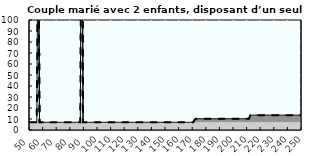
| Category | Coin fiscal marginal (somme des composantes) | Taux d’imposition marginal net |
|---|---|---|
| 50.0 | 7 | 7 |
| 51.0 | 7 | 7 |
| 52.0 | 7 | 7 |
| 53.0 | 7 | 7 |
| 54.0 | 7 | 7 |
| 55.0 | 7 | 7 |
| 56.0 | 225.815 | 225.815 |
| 57.0 | 7 | 7 |
| 58.0 | 7 | 7 |
| 59.0 | 7 | 7 |
| 60.0 | 7 | 7 |
| 61.0 | 7 | 7 |
| 62.0 | 7 | 7 |
| 63.0 | 7 | 7 |
| 64.0 | 7 | 7 |
| 65.0 | 7 | 7 |
| 66.0 | 7 | 7 |
| 67.0 | 7 | 7 |
| 68.0 | 7 | 7 |
| 69.0 | 7 | 7 |
| 70.0 | 7 | 7 |
| 71.0 | 7 | 7 |
| 72.0 | 7 | 7 |
| 73.0 | 7 | 7 |
| 74.0 | 7 | 7 |
| 75.0 | 7 | 7 |
| 76.0 | 7 | 7 |
| 77.0 | 7 | 7 |
| 78.0 | 7 | 7 |
| 79.0 | 7 | 7 |
| 80.0 | 7 | 7 |
| 81.0 | 7 | 7 |
| 82.0 | 7 | 7 |
| 83.0 | 7 | 7 |
| 84.0 | 7 | 7 |
| 85.0 | 7 | 7 |
| 86.0 | 7 | 7 |
| 87.0 | 7 | 7 |
| 88.0 | 352.947 | 352.947 |
| 89.0 | 7 | 7 |
| 90.0 | 7 | 7 |
| 91.0 | 7 | 7 |
| 92.0 | 7 | 7 |
| 93.0 | 7 | 7 |
| 94.0 | 7 | 7 |
| 95.0 | 7 | 7 |
| 96.0 | 7 | 7 |
| 97.0 | 7 | 7 |
| 98.0 | 7 | 7 |
| 99.0 | 7 | 7 |
| 100.0 | 7 | 7 |
| 101.0 | 7 | 7 |
| 102.0 | 7 | 7 |
| 103.0 | 7 | 7 |
| 104.0 | 7 | 7 |
| 105.0 | 7 | 7 |
| 106.0 | 7 | 7 |
| 107.0 | 7 | 7 |
| 108.0 | 7 | 7 |
| 109.0 | 7 | 7 |
| 110.0 | 7 | 7 |
| 111.0 | 7 | 7 |
| 112.0 | 7 | 7 |
| 113.0 | 7 | 7 |
| 114.0 | 7 | 7 |
| 115.0 | 7 | 7 |
| 116.0 | 7 | 7 |
| 117.0 | 7 | 7 |
| 118.0 | 7 | 7 |
| 119.0 | 7 | 7 |
| 120.0 | 7 | 7 |
| 121.0 | 7 | 7 |
| 122.0 | 7 | 7 |
| 123.0 | 7 | 7 |
| 124.0 | 7 | 7 |
| 125.0 | 7 | 7 |
| 126.0 | 7 | 7 |
| 127.0 | 7 | 7 |
| 128.0 | 7 | 7 |
| 129.0 | 7 | 7 |
| 130.0 | 7 | 7 |
| 131.0 | 7 | 7 |
| 132.0 | 7 | 7 |
| 133.0 | 7 | 7 |
| 134.0 | 7 | 7 |
| 135.0 | 7 | 7 |
| 136.0 | 7 | 7 |
| 137.0 | 7 | 7 |
| 138.0 | 7 | 7 |
| 139.0 | 7 | 7 |
| 140.0 | 7 | 7 |
| 141.0 | 7 | 7 |
| 142.0 | 7 | 7 |
| 143.0 | 7 | 7 |
| 144.0 | 7 | 7 |
| 145.0 | 7 | 7 |
| 146.0 | 7 | 7 |
| 147.0 | 7 | 7 |
| 148.0 | 7 | 7 |
| 149.0 | 7 | 7 |
| 150.0 | 7 | 7 |
| 151.0 | 7 | 7 |
| 152.0 | 7 | 7 |
| 153.0 | 7 | 7 |
| 154.0 | 7 | 7 |
| 155.0 | 7 | 7 |
| 156.0 | 7 | 7 |
| 157.0 | 7 | 7 |
| 158.0 | 7 | 7 |
| 159.0 | 7 | 7 |
| 160.0 | 7 | 7 |
| 161.0 | 7 | 7 |
| 162.0 | 7 | 7 |
| 163.0 | 7 | 7 |
| 164.0 | 7 | 7 |
| 165.0 | 7 | 7 |
| 166.0 | 7 | 7 |
| 167.0 | 7 | 7 |
| 168.0 | 7 | 7 |
| 169.0 | 7 | 7 |
| 170.0 | 7 | 7 |
| 171.0 | 9.322 | 9.322 |
| 172.0 | 10.25 | 10.25 |
| 173.0 | 10.25 | 10.25 |
| 174.0 | 10.25 | 10.25 |
| 175.0 | 10.25 | 10.25 |
| 176.0 | 10.25 | 10.25 |
| 177.0 | 10.25 | 10.25 |
| 178.0 | 10.25 | 10.25 |
| 179.0 | 10.25 | 10.25 |
| 180.0 | 10.25 | 10.25 |
| 181.0 | 10.25 | 10.25 |
| 182.0 | 10.25 | 10.25 |
| 183.0 | 10.25 | 10.25 |
| 184.0 | 10.25 | 10.25 |
| 185.0 | 10.25 | 10.25 |
| 186.0 | 10.25 | 10.25 |
| 187.0 | 10.25 | 10.25 |
| 188.0 | 10.25 | 10.25 |
| 189.0 | 10.25 | 10.25 |
| 190.0 | 10.25 | 10.25 |
| 191.0 | 10.25 | 10.25 |
| 192.0 | 10.25 | 10.25 |
| 193.0 | 10.25 | 10.25 |
| 194.0 | 10.25 | 10.25 |
| 195.0 | 10.25 | 10.25 |
| 196.0 | 10.25 | 10.25 |
| 197.0 | 10.25 | 10.25 |
| 198.0 | 10.25 | 10.25 |
| 199.0 | 10.25 | 10.25 |
| 200.0 | 10.25 | 10.25 |
| 201.0 | 10.25 | 10.25 |
| 202.0 | 10.25 | 10.25 |
| 203.0 | 10.25 | 10.25 |
| 204.0 | 10.25 | 10.25 |
| 205.0 | 10.25 | 10.25 |
| 206.0 | 10.25 | 10.25 |
| 207.0 | 10.25 | 10.25 |
| 208.0 | 10.25 | 10.25 |
| 209.0 | 10.25 | 10.25 |
| 210.0 | 10.25 | 10.25 |
| 211.0 | 10.25 | 10.25 |
| 212.0 | 13.369 | 13.369 |
| 213.0 | 13.5 | 13.5 |
| 214.0 | 13.5 | 13.5 |
| 215.0 | 13.5 | 13.5 |
| 216.0 | 13.5 | 13.5 |
| 217.0 | 13.5 | 13.5 |
| 218.0 | 13.5 | 13.5 |
| 219.0 | 13.5 | 13.5 |
| 220.0 | 13.5 | 13.5 |
| 221.0 | 13.5 | 13.5 |
| 222.0 | 13.5 | 13.5 |
| 223.0 | 13.5 | 13.5 |
| 224.0 | 13.5 | 13.5 |
| 225.0 | 13.5 | 13.5 |
| 226.0 | 13.5 | 13.5 |
| 227.0 | 13.5 | 13.5 |
| 228.0 | 13.5 | 13.5 |
| 229.0 | 13.5 | 13.5 |
| 230.0 | 13.5 | 13.5 |
| 231.0 | 13.5 | 13.5 |
| 232.0 | 13.5 | 13.5 |
| 233.0 | 13.5 | 13.5 |
| 234.0 | 13.5 | 13.5 |
| 235.0 | 13.5 | 13.5 |
| 236.0 | 13.5 | 13.5 |
| 237.0 | 13.5 | 13.5 |
| 238.0 | 13.5 | 13.5 |
| 239.0 | 13.5 | 13.5 |
| 240.0 | 13.5 | 13.5 |
| 241.0 | 13.5 | 13.5 |
| 242.0 | 13.5 | 13.5 |
| 243.0 | 13.5 | 13.5 |
| 244.0 | 13.5 | 13.5 |
| 245.0 | 13.5 | 13.5 |
| 246.0 | 13.5 | 13.5 |
| 247.0 | 13.5 | 13.5 |
| 248.0 | 13.5 | 13.5 |
| 249.0 | 13.5 | 13.5 |
| 250.0 | 13.5 | 13.5 |